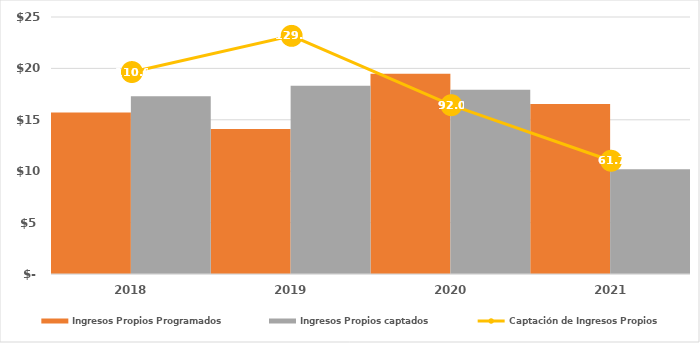
| Category | Ingresos Propios Programados | Ingresos Propios captados |
|---|---|---|
| 2018.0 | 15714.18 | 17287.697 |
| 2019.0 | 14115.571 | 18310.548 |
| 2020.0 | 19486.078 | 17917.975 |
| 2021.0 | 16529.292 | 10196.453 |